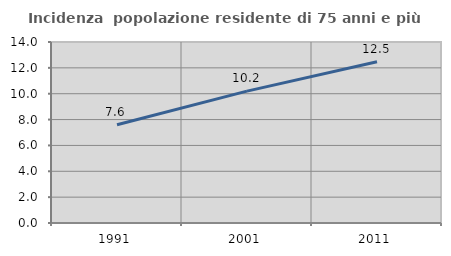
| Category | Incidenza  popolazione residente di 75 anni e più |
|---|---|
| 1991.0 | 7.6 |
| 2001.0 | 10.201 |
| 2011.0 | 12.477 |